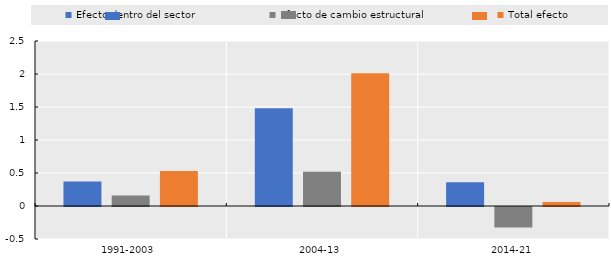
| Category | Efecto dentro del sector | Efecto de cambio estructural | Total efecto |
|---|---|---|---|
| 1991-2003 | 0.37 | 0.16 | 0.53 |
| 2004-13 | 1.48 | 0.52 | 2.01 |
| 2014-21 | 0.36 | -0.31 | 0.06 |